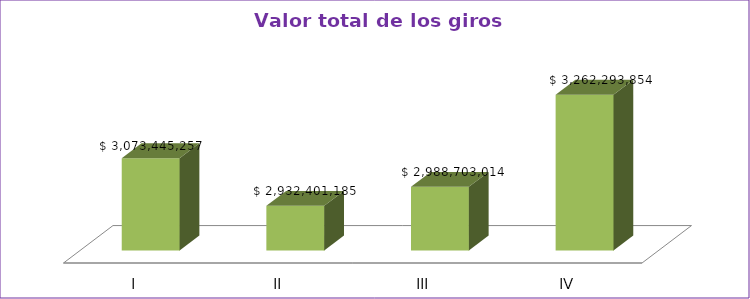
| Category | Series 0 |
|---|---|
| I | 3073445257 |
| II | 2932401185 |
| III | 2988703014 |
| IV | 3262293854 |